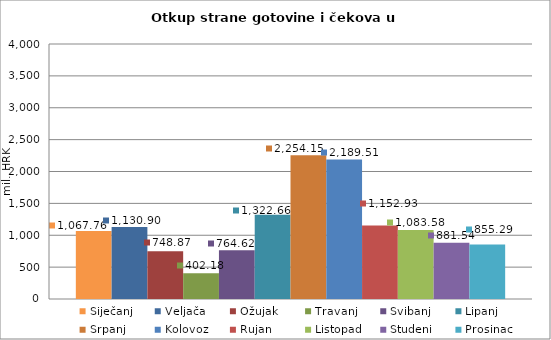
| Category | Siječanj | Veljača | Ožujak | Travanj | Svibanj | Lipanj | Srpanj | Kolovoz | Rujan | Listopad | Studeni | Prosinac |
|---|---|---|---|---|---|---|---|---|---|---|---|---|
| 0 | 1067.762 | 1130.902 | 748.873 | 402.177 | 764.622 | 1322.658 | 2254.152 | 2189.512 | 1152.934 | 1083.582 | 881.54 | 855.293 |